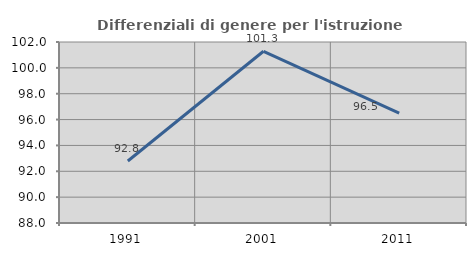
| Category | Differenziali di genere per l'istruzione superiore |
|---|---|
| 1991.0 | 92.798 |
| 2001.0 | 101.282 |
| 2011.0 | 96.494 |